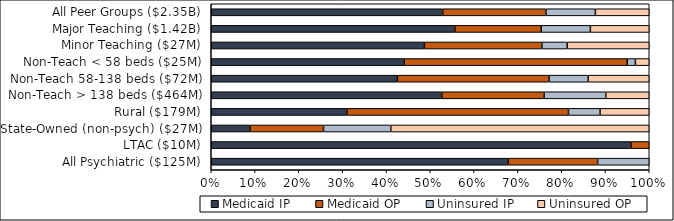
| Category | Medicaid IP | Medicaid OP | Uninsured IP | Uninsured OP |
|---|---|---|---|---|
| All Peer Groups ($2.35B) | 0.528 | 0.236 | 0.113 | 0.123 |
| Major Teaching ($1.42B) | 0.556 | 0.197 | 0.112 | 0.134 |
| Minor Teaching ($27M) | 0.487 | 0.268 | 0.058 | 0.187 |
| Non-Teach < 58 beds ($25M) | 0.44 | 0.509 | 0.019 | 0.032 |
| Non-Teach 58-138 beds ($72M) | 0.425 | 0.346 | 0.089 | 0.14 |
| Non-Teach > 138 beds ($464M) | 0.526 | 0.233 | 0.141 | 0.099 |
| Rural ($179M) | 0.31 | 0.506 | 0.072 | 0.112 |
| State-Owned (non-psych) ($27M) | 0.089 | 0.168 | 0.154 | 0.59 |
| LTAC ($10M) | 0.958 | 0.042 | 0 | 0 |
| All Psychiatric ($125M) | 0.678 | 0.204 | 0.118 | 0 |